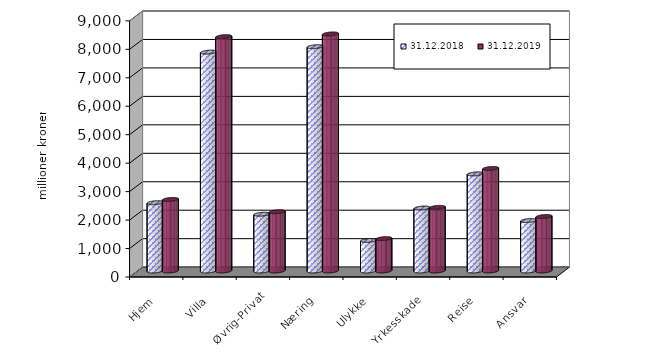
| Category | 31.12.2018 | 31.12.2019 |
|---|---|---|
| Hjem | 2399.859 | 2514.531 |
| Villa | 7691.001 | 8234.546 |
| Øvrig-Privat | 1994.739 | 2082.609 |
| Næring | 7881.208 | 8329.778 |
| Ulykke | 1074.145 | 1137.834 |
| Yrkesskade | 2212.892 | 2236.295 |
| Reise | 3414.145 | 3602.626 |
| Ansvar | 1773.213 | 1914.741 |